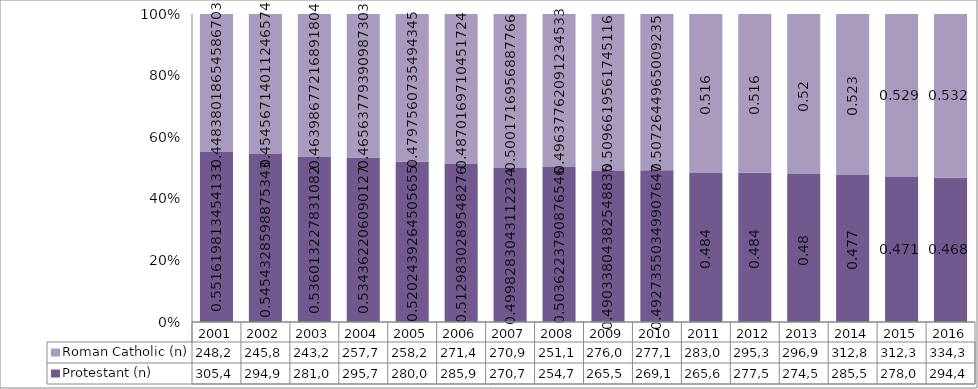
| Category | Protestant (n) | Roman Catholic (n) |
|---|---|---|
| 2001.0 | 305401 | 248243 |
| 2002.0 | 294963 | 245824 |
| 2003.0 | 281058 | 243291 |
| 2004.0 | 295762 | 257724 |
| 2005.0 | 280078 | 258281 |
| 2006.0 | 285947 | 271473 |
| 2007.0 | 270735 | 270921 |
| 2008.0 | 254774 | 251109 |
| 2009.0 | 265546 | 276011 |
| 2010.0 | 269175 | 277112 |
| 2011.0 | 265679 | 283093 |
| 2012.0 | 277598 | 295395 |
| 2013.0 | 274559 | 296969 |
| 2014.0 | 285598 | 312871 |
| 2015.0 | 278050 | 312370 |
| 2016.0 | 294418 | 334389 |